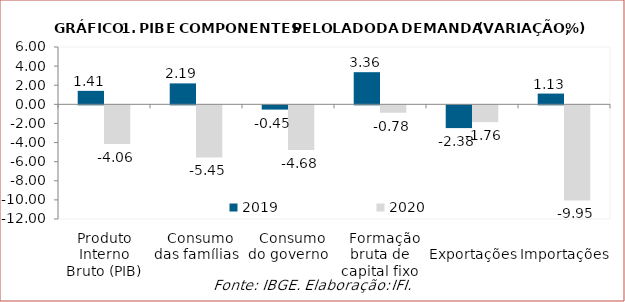
| Category | 2019 | 2020 |
|---|---|---|
| Produto Interno Bruto (PIB) | 1.411 | -4.059 |
|   Consumo das famílias | 2.191 | -5.454 |
|   Consumo do governo | -0.445 | -4.68 |
|   Formação bruta de capital fixo | 3.364 | -0.777 |
|   Exportações | -2.382 | -1.756 |
|   Importações | 1.126 | -9.952 |